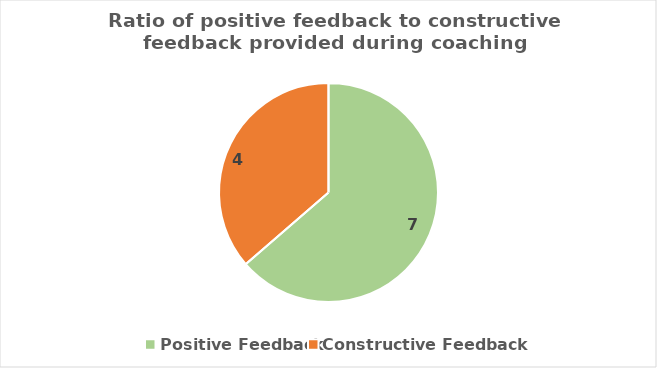
| Category | Feedback type |
|---|---|
| Positive Feedback | 7 |
| Constructive Feedback | 4 |